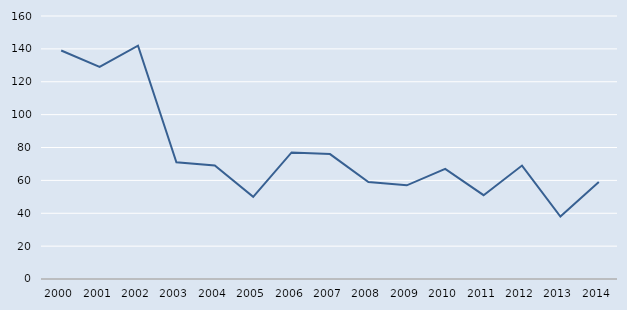
| Category | Series 0 |
|---|---|
| 2000.0 | 139 |
| 2001.0 | 129 |
| 2002.0 | 142 |
| 2003.0 | 71 |
| 2004.0 | 69 |
| 2005.0 | 50 |
| 2006.0 | 77 |
| 2007.0 | 76 |
| 2008.0 | 59 |
| 2009.0 | 57 |
| 2010.0 | 67 |
| 2011.0 | 51 |
| 2012.0 | 69 |
| 2013.0 | 38 |
| 2014.0 | 59 |